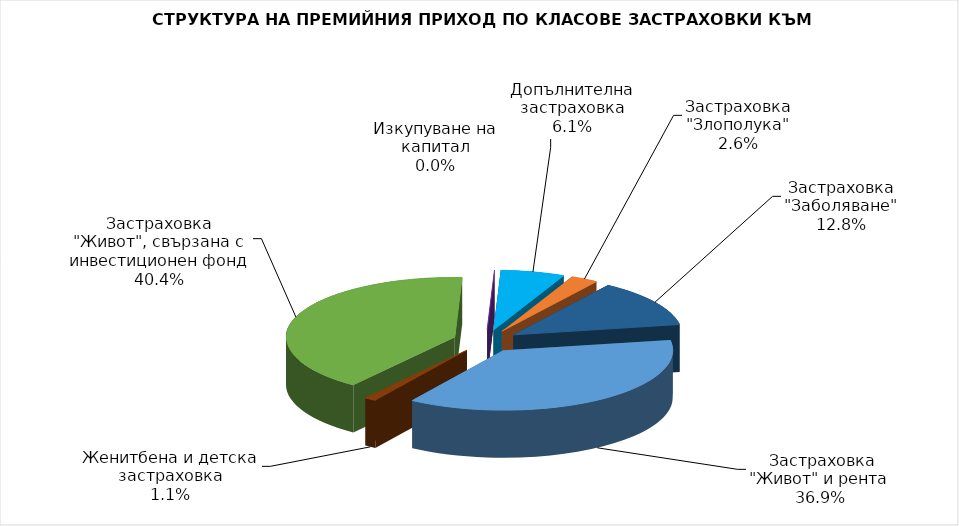
| Category |  Застраховка "Живот" и рента |
|---|---|
|  Застраховка "Живот" и рента | 224212625.106 |
| Женитбена и детска застраховка | 6863303.934 |
| Застраховка "Живот", свързана с инвестиционен фонд | 245615033.845 |
| Изкупуване на капитал | 0 |
| Допълнителна застраховка | 37251571.787 |
| Застраховка "Злополука" | 15966082.154 |
| Застраховка "Заболяване" | 77560542.27 |